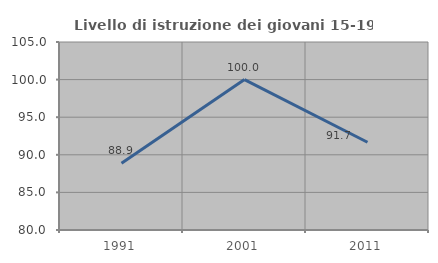
| Category | Livello di istruzione dei giovani 15-19 anni |
|---|---|
| 1991.0 | 88.889 |
| 2001.0 | 100 |
| 2011.0 | 91.667 |